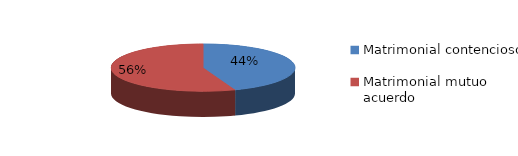
| Category | Series 0 |
|---|---|
| 0 | 258 |
| 1 | 324 |